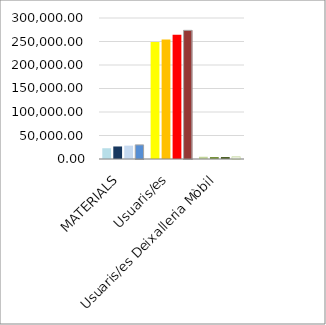
| Category | 2017 | 2018 | 2019 | 2020 |
|---|---|---|---|---|
| MATERIALS | 22899.17 | 26644.865 | 28426.657 | 30008.421 |
| Usuaris/es | 248807 | 254435 | 264421 | 273716 |
| Usuaris/es Deixalleria Mòbil | 4779 | 4237 | 4276 | 4956 |